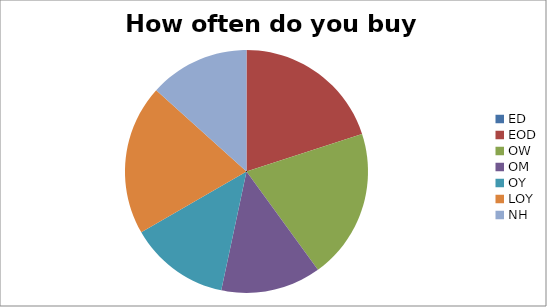
| Category | Series 0 |
|---|---|
| ED | 0 |
| EOD | 3 |
| OW | 3 |
| OM | 2 |
| OY | 2 |
| LOY | 3 |
| NH | 2 |